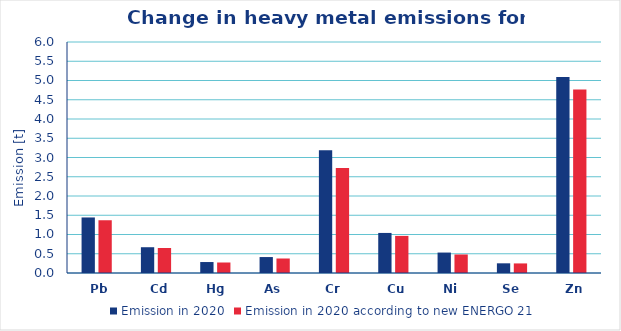
| Category | Emission in 2020 | Emission in 2020 according to new ENERGO 21 |
|---|---|---|
| Pb | 1.443 | 1.37 |
| Cd | 0.67 | 0.649 |
| Hg | 0.285 | 0.273 |
| As | 0.414 | 0.377 |
| Cr | 3.191 | 2.73 |
| Cu | 1.041 | 0.964 |
| Ni | 0.531 | 0.481 |
| Se | 0.251 | 0.249 |
| Zn | 5.092 | 4.764 |